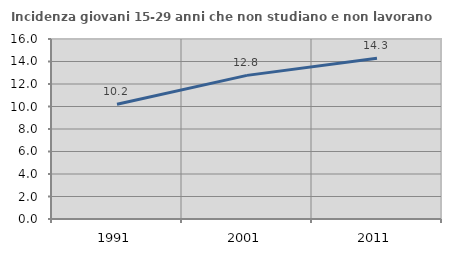
| Category | Incidenza giovani 15-29 anni che non studiano e non lavorano  |
|---|---|
| 1991.0 | 10.194 |
| 2001.0 | 12.766 |
| 2011.0 | 14.286 |